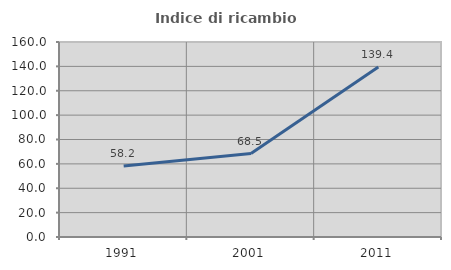
| Category | Indice di ricambio occupazionale  |
|---|---|
| 1991.0 | 58.228 |
| 2001.0 | 68.504 |
| 2011.0 | 139.409 |